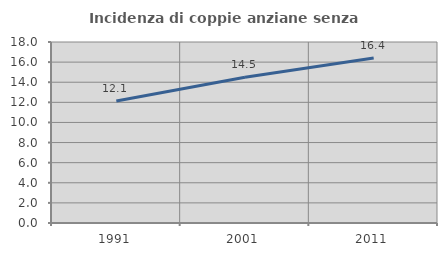
| Category | Incidenza di coppie anziane senza figli  |
|---|---|
| 1991.0 | 12.134 |
| 2001.0 | 14.493 |
| 2011.0 | 16.41 |